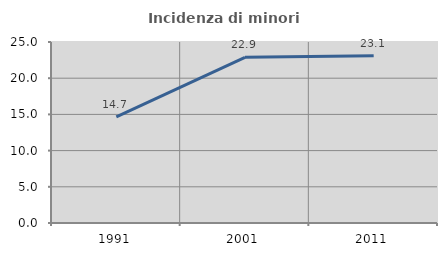
| Category | Incidenza di minori stranieri |
|---|---|
| 1991.0 | 14.667 |
| 2001.0 | 22.887 |
| 2011.0 | 23.099 |